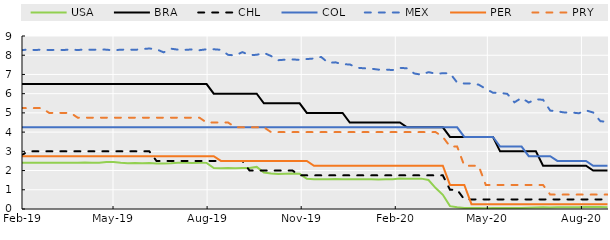
| Category | USA | BRA | CHL | COL | MEX | PER | PRY |
|---|---|---|---|---|---|---|---|
| 2019-01-02 | 2.4 | 6.5 | 2.75 | 4.25 | 8.35 | 2.75 | 5.25 |
| 2019-01-09 | 2.4 | 6.5 | 2.75 | 4.25 | 8.26 | 2.75 | 5.25 |
| 2019-01-16 | 2.4 | 6.5 | 2.75 | 4.25 | 8.29 | 2.75 | 5.25 |
| 2019-01-23 | 2.4 | 6.5 | 2.75 | 4.25 | 8.26 | 2.75 | 5.25 |
| 2019-01-30 | 2.4 | 6.5 | 2.75 | 4.25 | 8.25 | 2.75 | 5.25 |
| 2019-02-06 | 2.4 | 6.5 | 3 | 4.25 | 8.3 | 2.75 | 5.25 |
| 2019-02-13 | 2.4 | 6.5 | 3 | 4.25 | 8.27 | 2.75 | 5.25 |
| 2019-02-20 | 2.4 | 6.5 | 3 | 4.25 | 8.29 | 2.75 | 5.25 |
| 2019-02-27 | 2.4 | 6.5 | 3 | 4.25 | 8.27 | 2.75 | 5 |
| 2019-03-06 | 2.4 | 6.5 | 3 | 4.25 | 8.28 | 2.75 | 5 |
| 2019-03-13 | 2.4 | 6.5 | 3 | 4.25 | 8.27 | 2.75 | 5 |
| 2019-03-20 | 2.4 | 6.5 | 3 | 4.25 | 8.3 | 2.75 | 5 |
| 2019-03-27 | 2.41 | 6.5 | 3 | 4.25 | 8.27 | 2.75 | 4.75 |
| 2019-04-03 | 2.42 | 6.5 | 3 | 4.25 | 8.3 | 2.75 | 4.75 |
| 2019-04-10 | 2.41 | 6.5 | 3 | 4.25 | 8.28 | 2.75 | 4.75 |
| 2019-04-17 | 2.41 | 6.5 | 3 | 4.25 | 8.3 | 2.75 | 4.75 |
| 2019-04-24 | 2.44 | 6.5 | 3 | 4.25 | 8.29 | 2.75 | 4.75 |
| 2019-05-01 | 2.44 | 6.5 | 3 | 4.25 | 8.25 | 2.75 | 4.75 |
| 2019-05-08 | 2.4 | 6.5 | 3 | 4.25 | 8.29 | 2.75 | 4.75 |
| 2019-05-15 | 2.38 | 6.5 | 3 | 4.25 | 8.29 | 2.75 | 4.75 |
| 2019-05-22 | 2.39 | 6.5 | 3 | 4.25 | 8.28 | 2.75 | 4.75 |
| 2019-05-29 | 2.38 | 6.5 | 3 | 4.25 | 8.32 | 2.75 | 4.75 |
| 2019-06-05 | 2.39 | 6.5 | 3 | 4.25 | 8.35 | 2.75 | 4.75 |
| 2019-06-12 | 2.37 | 6.5 | 2.5 | 4.25 | 8.31 | 2.75 | 4.75 |
| 2019-06-19 | 2.37 | 6.5 | 2.5 | 4.25 | 8.15 | 2.75 | 4.75 |
| 2019-06-26 | 2.38 | 6.5 | 2.5 | 4.25 | 8.34 | 2.75 | 4.75 |
| 2019-07-03 | 2.4 | 6.5 | 2.5 | 4.25 | 8.29 | 2.75 | 4.75 |
| 2019-07-10 | 2.41 | 6.5 | 2.5 | 4.25 | 8.28 | 2.75 | 4.75 |
| 2019-07-17 | 2.39 | 6.5 | 2.5 | 4.25 | 8.3 | 2.75 | 4.75 |
| 2019-07-24 | 2.41 | 6.5 | 2.5 | 4.25 | 8.26 | 2.75 | 4.75 |
| 2019-07-31 | 2.4 | 6.5 | 2.5 | 4.25 | 8.31 | 2.75 | 4.5 |
| 2019-08-07 | 2.13 | 6 | 2.5 | 4.25 | 8.31 | 2.75 | 4.5 |
| 2019-08-14 | 2.12 | 6 | 2.5 | 4.25 | 8.28 | 2.5 | 4.5 |
| 2019-08-21 | 2.13 | 6 | 2.5 | 4.25 | 8.02 | 2.5 | 4.5 |
| 2019-08-28 | 2.12 | 6 | 2.5 | 4.25 | 7.99 | 2.5 | 4.25 |
| 2019-09-04 | 2.13 | 6 | 2.5 | 4.25 | 8.16 | 2.5 | 4.25 |
| 2019-09-11 | 2.13 | 6 | 2 | 4.25 | 8.01 | 2.5 | 4.25 |
| 2019-09-18 | 2.19 | 6 | 2 | 4.25 | 8.02 | 2.5 | 4.25 |
| 2019-09-25 | 1.9 | 5.5 | 2 | 4.25 | 8.12 | 2.5 | 4.25 |
| 2019-10-02 | 1.85 | 5.5 | 2 | 4.25 | 7.96 | 2.5 | 4 |
| 2019-10-09 | 1.82 | 5.5 | 2 | 4.25 | 7.74 | 2.5 | 4 |
| 2019-10-16 | 1.84 | 5.5 | 2 | 4.25 | 7.77 | 2.5 | 4 |
| 2019-10-23 | 1.85 | 5.5 | 2 | 4.25 | 7.78 | 2.5 | 4 |
| 2019-10-30 | 1.83 | 5.5 | 1.75 | 4.25 | 7.76 | 2.5 | 4 |
| 2019-11-06 | 1.57 | 5 | 1.75 | 4.25 | 7.8 | 2.5 | 4 |
| 2019-11-13 | 1.55 | 5 | 1.75 | 4.25 | 7.83 | 2.25 | 4 |
| 2019-11-20 | 1.55 | 5 | 1.75 | 4.25 | 7.91 | 2.25 | 4 |
| 2019-11-27 | 1.55 | 5 | 1.75 | 4.25 | 7.6 | 2.25 | 4 |
| 2019-12-04 | 1.56 | 5 | 1.75 | 4.25 | 7.63 | 2.25 | 4 |
| 2019-12-11 | 1.55 | 5 | 1.75 | 4.25 | 7.53 | 2.25 | 4 |
| 2019-12-18 | 1.55 | 4.5 | 1.75 | 4.25 | 7.52 | 2.25 | 4 |
| 2019-12-25 | 1.55 | 4.5 | 1.75 | 4.25 | 7.35 | 2.25 | 4 |
| 2020-01-01 | 1.55 | 4.5 | 1.75 | 4.25 | 7.32 | 2.25 | 4 |
| 2020-01-08 | 1.55 | 4.5 | 1.75 | 4.25 | 7.3 | 2.25 | 4 |
| 2020-01-15 | 1.54 | 4.5 | 1.75 | 4.25 | 7.25 | 2.25 | 4 |
| 2020-01-22 | 1.55 | 4.5 | 1.75 | 4.25 | 7.25 | 2.25 | 4 |
| 2020-01-29 | 1.55 | 4.5 | 1.75 | 4.25 | 7.23 | 2.25 | 4 |
| 2020-02-05 | 1.59 | 4.5 | 1.75 | 4.25 | 7.34 | 2.25 | 4 |
| 2020-02-12 | 1.58 | 4.25 | 1.75 | 4.25 | 7.32 | 2.25 | 4 |
| 2020-02-19 | 1.58 | 4.25 | 1.75 | 4.25 | 7.05 | 2.25 | 4 |
| 2020-02-26 | 1.58 | 4.25 | 1.75 | 4.25 | 6.99 | 2.25 | 4 |
| 2020-03-04 | 1.51 | 4.25 | 1.75 | 4.25 | 7.12 | 2.25 | 4 |
| 2020-03-11 | 1.09 | 4.25 | 1.75 | 4.25 | 7.04 | 2.25 | 4 |
| 2020-03-18 | 0.74 | 4.25 | 1.75 | 4.25 | 7.06 | 2.25 | 3.75 |
| 2020-03-25 | 0.15 | 3.75 | 1 | 4.25 | 7.06 | 1.25 | 3.25 |
| 2020-04-01 | 0.09 | 3.75 | 1 | 4.25 | 6.58 | 1.25 | 3.25 |
| 2020-04-08 | 0.05 | 3.75 | 0.5 | 3.75 | 6.53 | 1.25 | 2.25 |
| 2020-04-15 | 0.05 | 3.75 | 0.5 | 3.75 | 6.53 | 0.25 | 2.25 |
| 2020-04-22 | 0.05 | 3.75 | 0.5 | 3.75 | 6.47 | 0.25 | 2.25 |
| 2020-04-29 | 0.04 | 3.75 | 0.5 | 3.75 | 6.25 | 0.25 | 1.25 |
| 2020-05-06 | 0.05 | 3.75 | 0.5 | 3.75 | 6.05 | 0.25 | 1.25 |
| 2020-05-13 | 0.05 | 3 | 0.5 | 3.25 | 6.04 | 0.25 | 1.25 |
| 2020-05-20 | 0.05 | 3 | 0.5 | 3.25 | 5.99 | 0.25 | 1.25 |
| 2020-05-27 | 0.05 | 3 | 0.5 | 3.25 | 5.55 | 0.25 | 1.25 |
| 2020-06-03 | 0.05 | 3 | 0.5 | 3.25 | 5.78 | 0.25 | 1.25 |
| 2020-06-10 | 0.07 | 3 | 0.5 | 2.75 | 5.54 | 0.25 | 1.25 |
| 2020-06-17 | 0.08 | 3 | 0.5 | 2.75 | 5.71 | 0.25 | 1.25 |
| 2020-06-24 | 0.09 | 2.25 | 0.5 | 2.75 | 5.68 | 0.25 | 1.25 |
| 2020-07-01 | 0.08 | 2.25 | 0.5 | 2.75 | 5.12 | 0.25 | 0.75 |
| 2020-07-08 | 0.09 | 2.25 | 0.5 | 2.5 | 5.08 | 0.25 | 0.75 |
| 2020-07-15 | 0.09 | 2.25 | 0.5 | 2.5 | 5.02 | 0.25 | 0.75 |
| 2020-07-22 | 0.09 | 2.25 | 0.5 | 2.5 | 5.02 | 0.25 | 0.75 |
| 2020-07-29 | 0.09 | 2.25 | 0.5 | 2.5 | 4.98 | 0.25 | 0.75 |
| 2020-08-05 | 0.1 | 2.25 | 0.5 | 2.5 | 5.13 | 0.25 | 0.75 |
| 2020-08-12 | 0.1 | 2 | 0.5 | 2.25 | 5.02 | 0.25 | 0.75 |
| 2020-08-19 | 0.1 | 2 | 0.5 | 2.25 | 4.57 | 0.25 | 0.75 |
| 2020-08-26 | 0.09 | 2 | 0.5 | 2.25 | 4.53 | 0.25 | 0.75 |